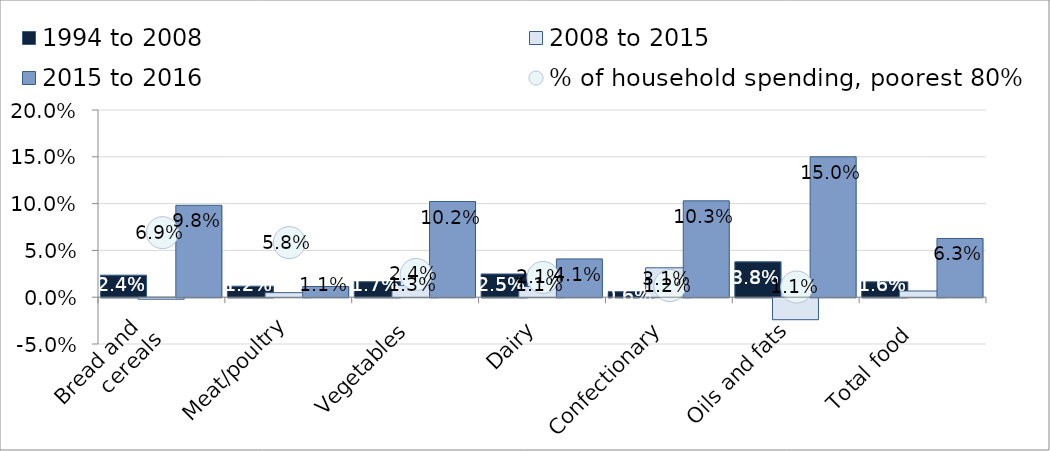
| Category | 1994 to 2008 | 2008 to 2015 | 2015 to 2016 |
|---|---|---|---|
| Bread and 
cereals | 0.024 | -0.002 | 0.098 |
| Meat/poultry | 0.012 | 0.005 | 0.011 |
| Vegetables | 0.017 | 0.013 | 0.102 |
| Dairy | 0.025 | 0.011 | 0.041 |
| Confectionary | 0.006 | 0.031 | 0.103 |
| Oils and fats | 0.038 | -0.023 | 0.15 |
| Total food | 0.016 | 0.007 | 0.063 |